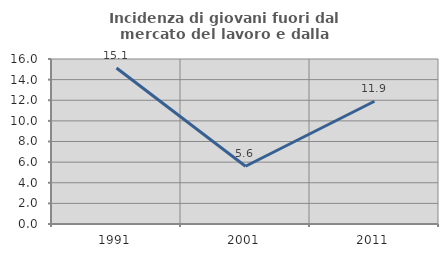
| Category | Incidenza di giovani fuori dal mercato del lavoro e dalla formazione  |
|---|---|
| 1991.0 | 15.132 |
| 2001.0 | 5.6 |
| 2011.0 | 11.905 |